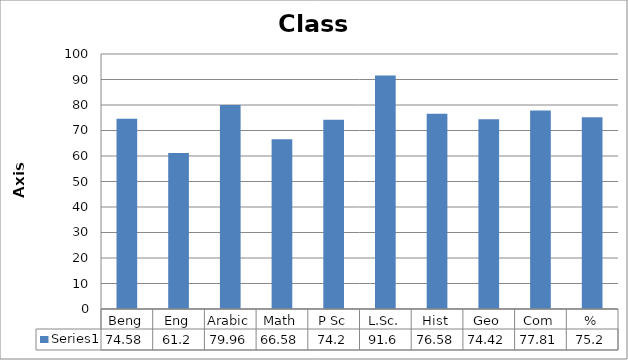
| Category | Series 0 |
|---|---|
| Beng | 74.58 |
| Eng | 61.2 |
| Arabic | 79.96 |
| Math | 66.58 |
| P Sc | 74.2 |
| L.Sc. | 91.6 |
| Hist | 76.58 |
| Geo | 74.42 |
| Com | 77.81 |
| % | 75.2 |